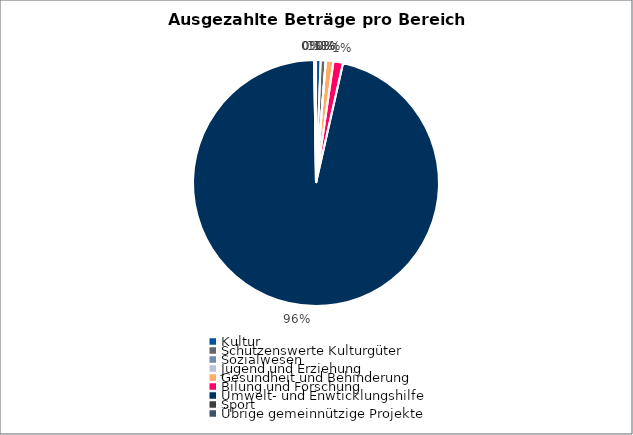
| Category | Series 0 |
|---|---|
| Kultur | 10000 |
| Schützenswerte Kulturgüter | 11000 |
| Sozialwesen | 0 |
| Jugend und Erziehung | 0 |
| Gesundheit und Behinderung | 16500 |
| Bilung und Forschung | 20773 |
| Umwelt- und Enwticklungshilfe | 1589835 |
| Sport | 0 |
| Übrige gemeinnützige Projekte | 4000 |